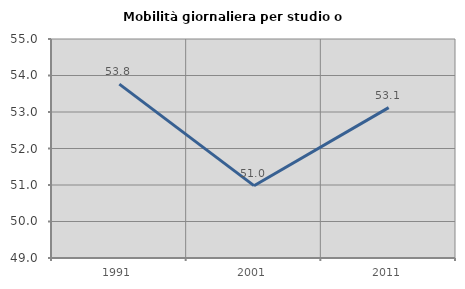
| Category | Mobilità giornaliera per studio o lavoro |
|---|---|
| 1991.0 | 53.763 |
| 2001.0 | 50.982 |
| 2011.0 | 53.121 |